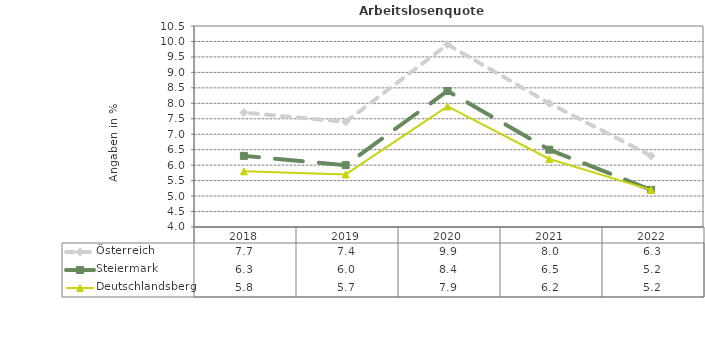
| Category | Österreich | Steiermark | Deutschlandsberg |
|---|---|---|---|
| 2022.0 | 6.3 | 5.2 | 5.2 |
| 2021.0 | 8 | 6.5 | 6.2 |
| 2020.0 | 9.9 | 8.4 | 7.9 |
| 2019.0 | 7.4 | 6 | 5.7 |
| 2018.0 | 7.7 | 6.3 | 5.8 |